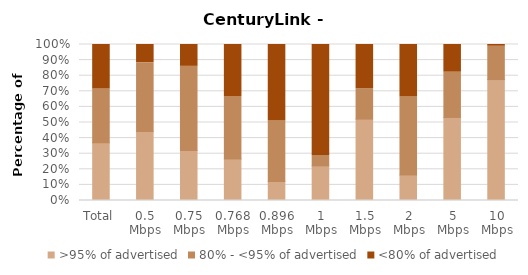
| Category | >95% of advertised | 80% - <95% of advertised | <80% of advertised |
|---|---|---|---|
| Total | 0.371 | 0.344 | 0.285 |
| 0.5 Mbps | 0.442 | 0.442 | 0.116 |
| 0.75 Mbps | 0.32 | 0.54 | 0.14 |
| 0.768 Mbps | 0.267 | 0.4 | 0.333 |
| 0.896 Mbps | 0.122 | 0.388 | 0.49 |
| 1 Mbps | 0.222 | 0.067 | 0.711 |
| 1.5 Mbps | 0.522 | 0.196 | 0.283 |
| 2 Mbps | 0.163 | 0.5 | 0.337 |
| 5 Mbps | 0.532 | 0.29 | 0.177 |
| 10 Mbps | 0.775 | 0.213 | 0.011 |